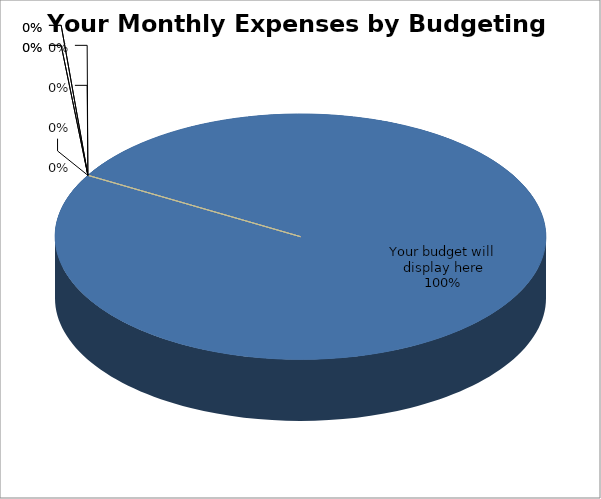
| Category | Series 0 |
|---|---|
| Your budget will display here | 1 |